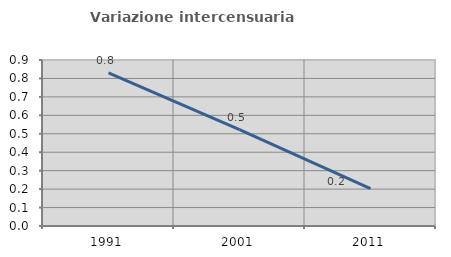
| Category | Variazione intercensuaria annua |
|---|---|
| 1991.0 | 0.83 |
| 2001.0 | 0.522 |
| 2011.0 | 0.203 |